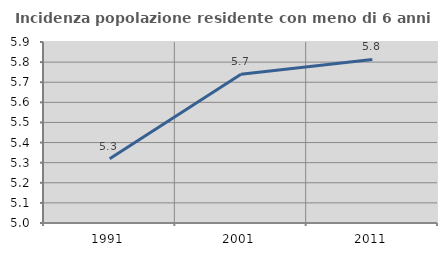
| Category | Incidenza popolazione residente con meno di 6 anni |
|---|---|
| 1991.0 | 5.319 |
| 2001.0 | 5.74 |
| 2011.0 | 5.813 |